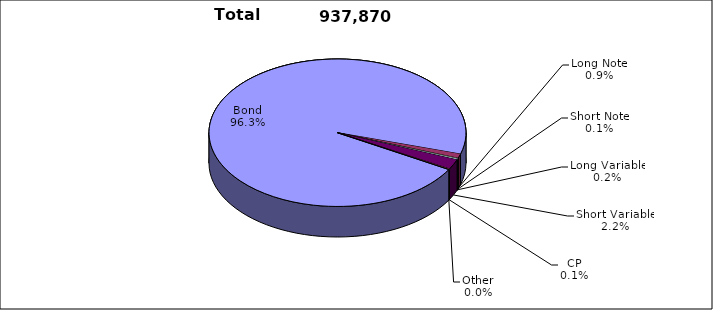
| Category | Trades |
|---|---|
| Bond | 903535 |
| Long Note | 8873 |
| Short Note | 1259 |
| Long Variable | 2115 |
| Short Variable | 20575 |
| CP | 1263 |
| Other | 250 |